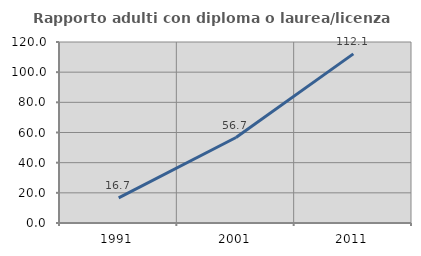
| Category | Rapporto adulti con diploma o laurea/licenza media  |
|---|---|
| 1991.0 | 16.667 |
| 2001.0 | 56.667 |
| 2011.0 | 112.121 |